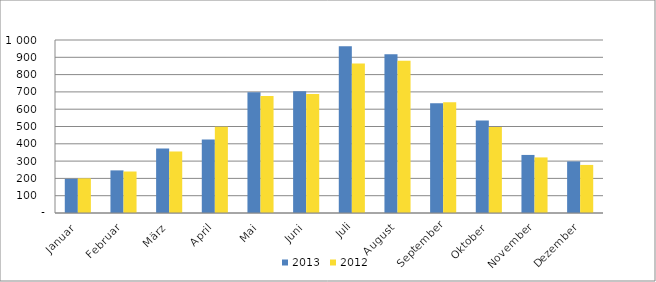
| Category | 2013 | 2012 |
|---|---|---|
| Januar | 197391 | 200237 |
| Februar | 246371 | 239827 |
| März | 373292 | 355578 |
| April | 425566 | 499218 |
| Mai | 698532 | 676668 |
| Juni | 703230 | 687560 |
| Juli | 963277 | 864347 |
| August | 917897 | 880537 |
| September | 634217 | 640315 |
| Oktober | 534147 | 497148 |
| November | 335629 | 321290 |
| Dezember | 298074 | 277824 |